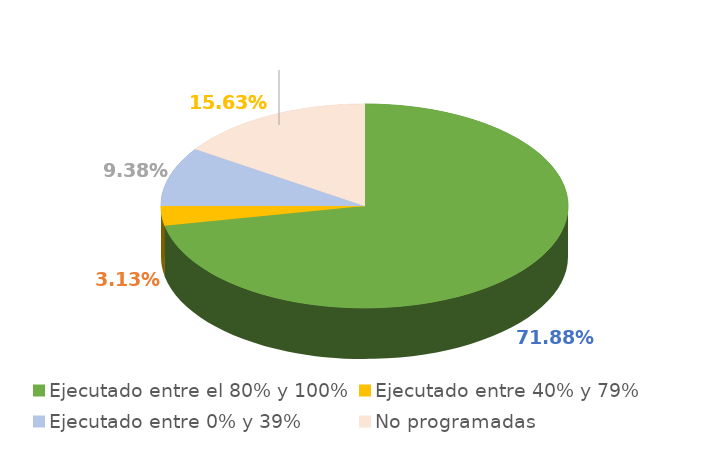
| Category | Series 0 |
|---|---|
| Ejecutado entre el 80% y 100% | 0.719 |
| Ejecutado entre 40% y 79% | 0.031 |
| Ejecutado entre 0% y 39% | 0.094 |
| No programadas | 0.156 |